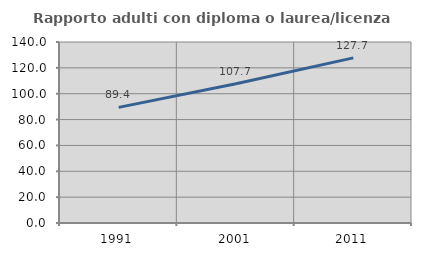
| Category | Rapporto adulti con diploma o laurea/licenza media  |
|---|---|
| 1991.0 | 89.423 |
| 2001.0 | 107.692 |
| 2011.0 | 127.703 |